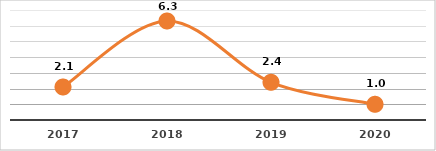
| Category | COBERTURA DE BECADOS EXTERNOS (%)
TERCER TRIMESTRE, EJERCICIO 2020 |
|---|---|
| 2017.0 | 2.1 |
| 2018.0 | 6.3 |
| 2019.0 | 2.4 |
| 2020.0 | 1 |